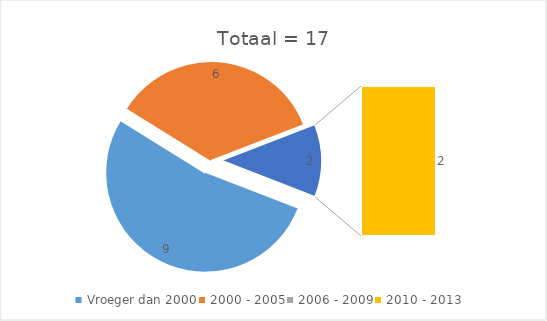
| Category | Aantal | Procent |
|---|---|---|
| Vroeger dan 2000 | 9 | 0.529 |
| 2000 - 2005 | 6 | 0.353 |
| 2006 - 2009 | 0 | 0 |
| 2010 - 2013 | 2 | 0.118 |